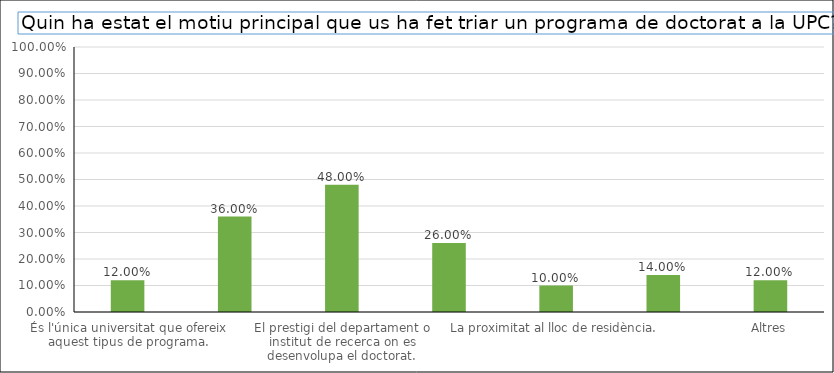
| Category | Series 0 |
|---|---|
| És l'única universitat que ofereix aquest tipus de programa. | 0.12 |
| El prestigi de la UPC. | 0.36 |
| El prestigi del departament o institut de recerca on es desenvolupa el doctorat. | 0.48 |
| El prestigi i la temàtica del grup de recerca. | 0.26 |
| La proximitat al lloc de residència. | 0.1 |
| Treballar a la UPC. | 0.14 |
| Altres | 0.12 |